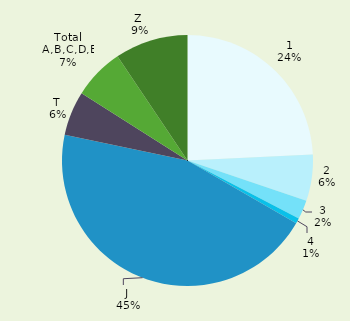
| Category | Series 0 |
|---|---|
| 1 | 0.242 |
| 2 | 0.06 |
| 3 | 0.024 |
| 4 | 0.007 |
| J  | 0.45 |
| T  | 0.057 |
| Total A,B,C,D,E | 0.066 |
| Z  | 0.094 |